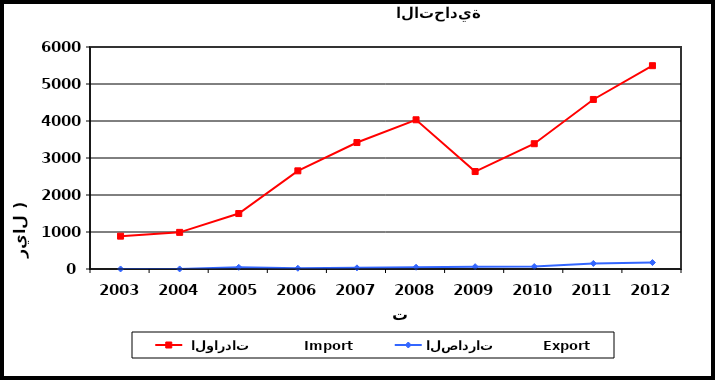
| Category |  الواردات           Import | الصادرات          Export |
|---|---|---|
| 2003.0 | 888 | 1 |
| 2004.0 | 990 | 2 |
| 2005.0 | 1499 | 46 |
| 2006.0 | 2653 | 20 |
| 2007.0 | 3418 | 31 |
| 2008.0 | 4033 | 48 |
| 2009.0 | 2634 | 63 |
| 2010.0 | 3386 | 67 |
| 2011.0 | 4582 | 151 |
| 2012.0 | 5495 | 174 |